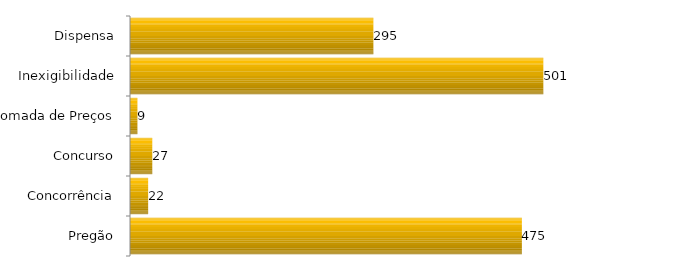
| Category | Total |
|---|---|
| Pregão | 475 |
| Concorrência | 22 |
| Concurso | 27 |
| Tomada de Preços | 9 |
| Inexigibilidade | 501 |
| Dispensa | 295 |